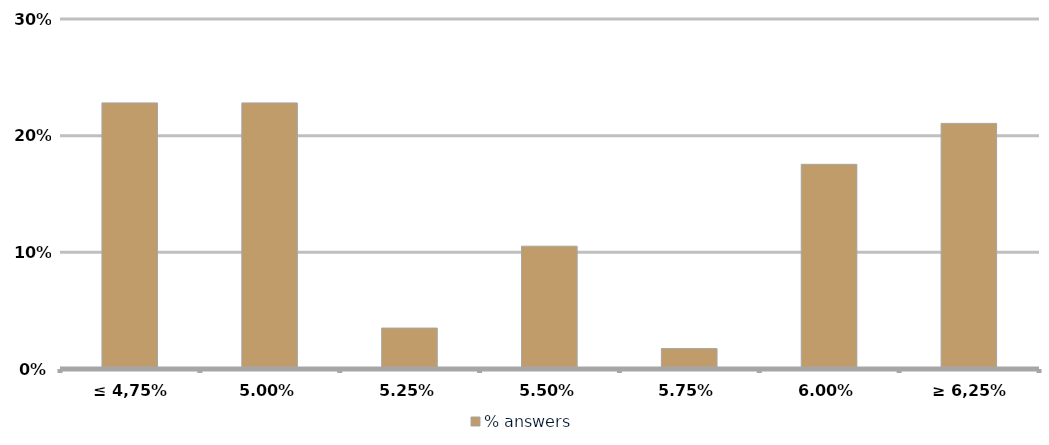
| Category | % answers |
|---|---|
| ≤ 4,75% | 0.228 |
| 5,00% | 0.228 |
| 5,25% | 0.035 |
| 5,50% | 0.105 |
| 5,75% | 0.018 |
| 6,00% | 0.175 |
| ≥ 6,25% | 0.211 |